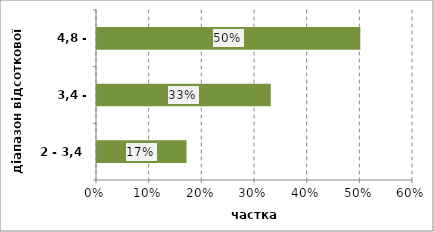
| Category | Series 0 |
|---|---|
| 2 - 3,4 | 0.17 |
| 3,4 - 4,8 | 0.33 |
| 4,8 - 6,2 | 0.5 |